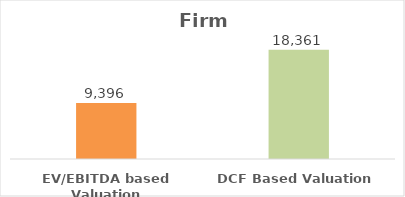
| Category | Series 0 |
|---|---|
| EV/EBITDA based Valuation | 9396 |
| DCF Based Valuation | 18360.842 |